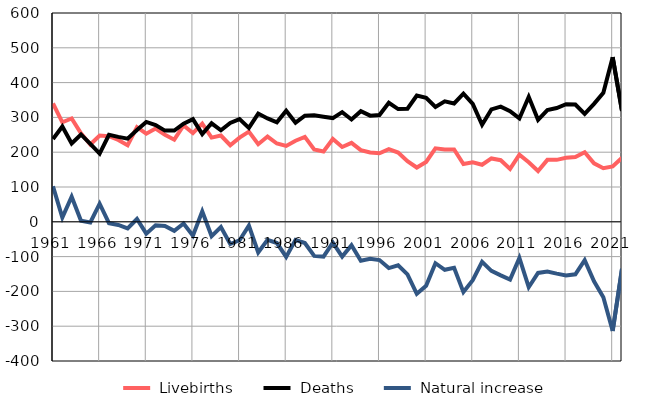
| Category |  Livebirths |  Deaths |  Natural increase |
|---|---|---|---|
| 1961.0 | 340 | 238 | 102 |
| 1962.0 | 286 | 274 | 12 |
| 1963.0 | 297 | 225 | 72 |
| 1964.0 | 254 | 251 | 3 |
| 1965.0 | 222 | 224 | -2 |
| 1966.0 | 248 | 196 | 52 |
| 1967.0 | 246 | 250 | -4 |
| 1968.0 | 235 | 244 | -9 |
| 1969.0 | 220 | 239 | -19 |
| 1970.0 | 272 | 264 | 8 |
| 1971.0 | 253 | 287 | -34 |
| 1972.0 | 268 | 278 | -10 |
| 1973.0 | 250 | 262 | -12 |
| 1974.0 | 236 | 262 | -26 |
| 1975.0 | 277 | 282 | -5 |
| 1976.0 | 255 | 295 | -40 |
| 1977.0 | 282 | 252 | 30 |
| 1978.0 | 242 | 283 | -41 |
| 1979.0 | 248 | 263 | -15 |
| 1980.0 | 220 | 284 | -64 |
| 1981.0 | 242 | 295 | -53 |
| 1982.0 | 259 | 270 | -11 |
| 1983.0 | 223 | 311 | -88 |
| 1984.0 | 245 | 297 | -52 |
| 1985.0 | 225 | 286 | -61 |
| 1986.0 | 218 | 319 | -101 |
| 1987.0 | 233 | 285 | -52 |
| 1988.0 | 244 | 305 | -61 |
| 1989.0 | 208 | 306 | -98 |
| 1990.0 | 202 | 302 | -100 |
| 1991.0 | 238 | 298 | -60 |
| 1992.0 | 215 | 315 | -100 |
| 1993.0 | 227 | 294 | -67 |
| 1994.0 | 206 | 318 | -112 |
| 1995.0 | 199 | 305 | -106 |
| 1996.0 | 197 | 307 | -110 |
| 1997.0 | 209 | 342 | -133 |
| 1998.0 | 199 | 324 | -125 |
| 1999.0 | 174 | 325 | -151 |
| 2000.0 | 156 | 363 | -207 |
| 2001.0 | 172 | 356 | -184 |
| 2002.0 | 211 | 330 | -119 |
| 2003.0 | 208 | 346 | -138 |
| 2004.0 | 208 | 340 | -132 |
| 2005.0 | 166 | 368 | -202 |
| 2006.0 | 171 | 339 | -168 |
| 2007.0 | 164 | 279 | -115 |
| 2008.0 | 182 | 323 | -141 |
| 2009.0 | 177 | 331 | -154 |
| 2010.0 | 152 | 318 | -166 |
| 2011.0 | 193 | 297 | -104 |
| 2012.0 | 171 | 359 | -188 |
| 2013.0 | 146 | 293 | -147 |
| 2014.0 | 178 | 321 | -143 |
| 2015.0 | 178 | 327 | -149 |
| 2016.0 | 184 | 338 | -154 |
| 2017.0 | 186 | 337 | -151 |
| 2018.0 | 200 | 310 | -110 |
| 2019.0 | 168 | 339 | -171 |
| 2020.0 | 154 | 371 | -217 |
| 2021.0 | 159 | 473 | -314 |
| 2022.0 | 184 | 319 | -135 |